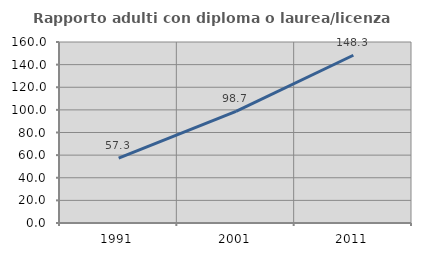
| Category | Rapporto adulti con diploma o laurea/licenza media  |
|---|---|
| 1991.0 | 57.278 |
| 2001.0 | 98.67 |
| 2011.0 | 148.298 |